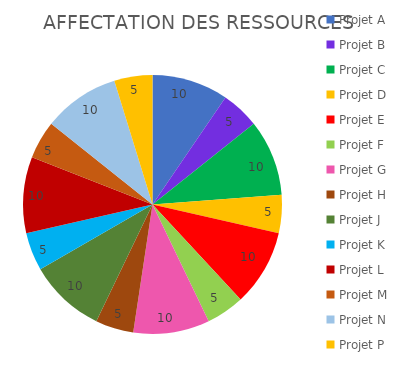
| Category | Series 0 |
|---|---|
| Projet A | 10 |
| Projet B | 5 |
| Projet C | 10 |
| Projet D | 5 |
| Projet E | 10 |
| Projet F | 5 |
| Projet G | 10 |
| Projet H | 5 |
| Projet J | 10 |
| Projet K | 5 |
| Projet L | 10 |
| Projet M | 5 |
| Projet N | 10 |
| Projet P | 5 |